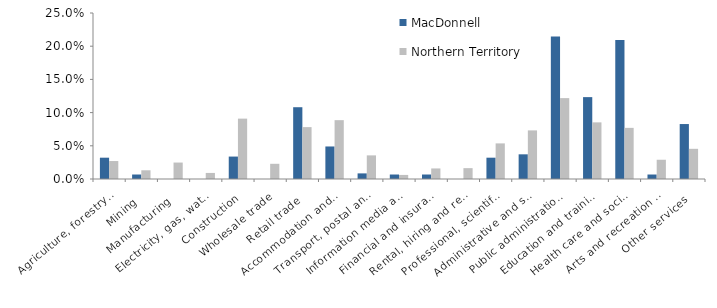
| Category | MacDonnell | Northern Territory |
|---|---|---|
| Agriculture, forestry and fishing | 0.032 | 0.027 |
| Mining | 0.007 | 0.013 |
| Manufacturing | 0 | 0.025 |
| Electricity, gas, water and waste services | 0 | 0.009 |
| Construction | 0.034 | 0.091 |
| Wholesale trade | 0 | 0.023 |
| Retail trade | 0.108 | 0.078 |
| Accommodation and food services | 0.049 | 0.089 |
| Transport, postal and warehousing | 0.008 | 0.036 |
| Information media and telecommunications | 0.007 | 0.006 |
| Financial and insurance services | 0.007 | 0.016 |
| Rental, hiring and real estate services | 0 | 0.016 |
| Professional, scientific and technical services | 0.032 | 0.054 |
| Administrative and support services | 0.037 | 0.073 |
| Public administration and safety | 0.215 | 0.122 |
| Education and training | 0.123 | 0.085 |
| Health care and social assistance | 0.209 | 0.077 |
| Arts and recreation services | 0.007 | 0.029 |
| Other services | 0.083 | 0.045 |